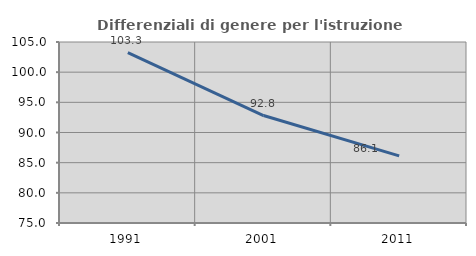
| Category | Differenziali di genere per l'istruzione superiore |
|---|---|
| 1991.0 | 103.255 |
| 2001.0 | 92.811 |
| 2011.0 | 86.121 |